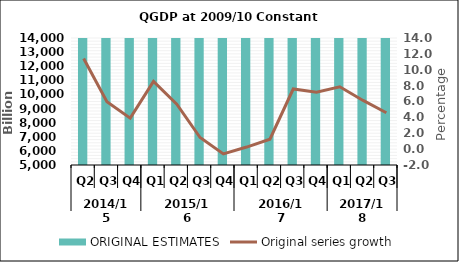
| Category | ORIGINAL ESTIMATES |
|---|---|
| 0 | 24825.71 |
| 1 | 24150.673 |
| 2 | 25458.923 |
| 3 | 28411.246 |
| 4 | 26228.783 |
| 5 | 24503.419 |
| 6 | 25303.519 |
| 7 | 28485.585 |
| 8 | 26556.754 |
| 9 | 26359.326 |
| 10 | 27116.376 |
| 11 | 30721.31 |
| 12 | 28185.425 |
| 13 | 27567.514 |